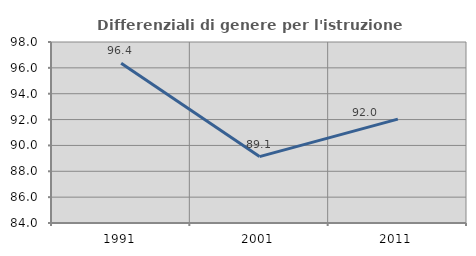
| Category | Differenziali di genere per l'istruzione superiore |
|---|---|
| 1991.0 | 96.364 |
| 2001.0 | 89.138 |
| 2011.0 | 92.031 |